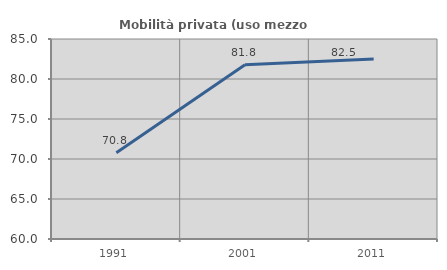
| Category | Mobilità privata (uso mezzo privato) |
|---|---|
| 1991.0 | 70.777 |
| 2001.0 | 81.789 |
| 2011.0 | 82.489 |